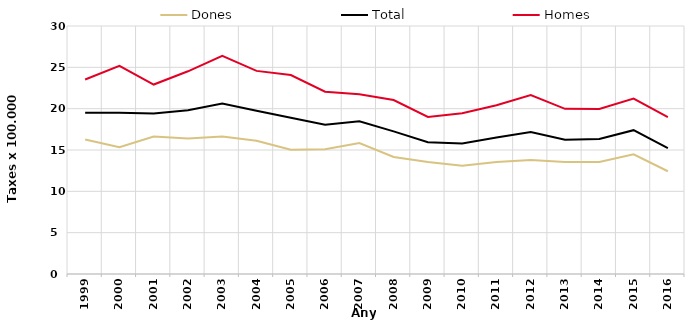
| Category | Dones | Total | Homes |
|---|---|---|---|
| 1999.0 | 16.28 | 19.5 | 23.53 |
| 2000.0 | 15.33 | 19.51 | 25.19 |
| 2001.0 | 16.63 | 19.41 | 22.92 |
| 2002.0 | 16.4 | 19.82 | 24.52 |
| 2003.0 | 16.63 | 20.61 | 26.4 |
| 2004.0 | 16.13 | 19.74 | 24.57 |
| 2005.0 | 15.03 | 18.9 | 24.07 |
| 2006.0 | 15.08 | 18.07 | 22.05 |
| 2007.0 | 15.85 | 18.47 | 21.74 |
| 2008.0 | 14.16 | 17.25 | 21.05 |
| 2009.0 | 13.55 | 15.93 | 19 |
| 2010.0 | 13.09 | 15.8 | 19.45 |
| 2011.0 | 13.55 | 16.51 | 20.41 |
| 2012.0 | 13.79 | 17.18 | 21.64 |
| 2013.0 | 13.54 | 16.25 | 19.98 |
| 2014.0 | 13.56 | 16.34 | 19.95 |
| 2015.0 | 14.48 | 17.4 | 21.23 |
| 2016.0 | 12.43 | 15.24 | 18.99 |